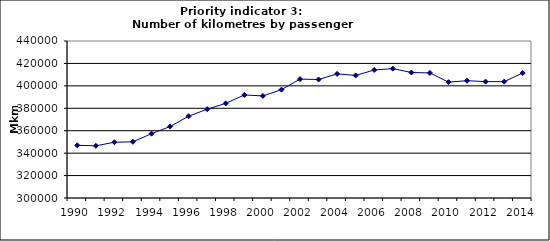
| Category | Number of kilometres by passenger cars, Mkm |
|---|---|
| 1990 | 346995.357 |
| 1991 | 346532.663 |
| 1992 | 349738.775 |
| 1993 | 350130.129 |
| 1994 | 357350.864 |
| 1995 | 363740.191 |
| 1996 | 372933.007 |
| 1997 | 379198.172 |
| 1998 | 384388.467 |
| 1999 | 391888.548 |
| 2000 | 391017.047 |
| 2001 | 396599.101 |
| 2002 | 405999.652 |
| 2003 | 405657.243 |
| 2004 | 410686.641 |
| 2005 | 409293.127 |
| 2006 | 414166.629 |
| 2007 | 415356.109 |
| 2008 | 411934.574 |
| 2009 | 411534.403 |
| 2010 | 403327.686 |
| 2011 | 404594.504 |
| 2012 | 403777.467 |
| 2013 | 403758.876 |
| 2014 | 411441.799 |